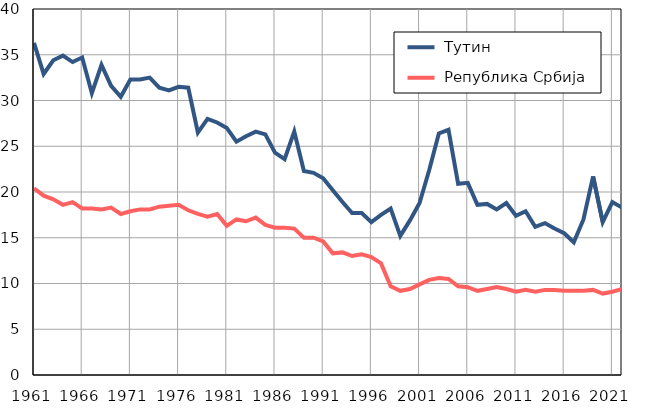
| Category |  Тутин |  Република Србија |
|---|---|---|
| 1961.0 | 36.3 | 20.4 |
| 1962.0 | 32.9 | 19.6 |
| 1963.0 | 34.4 | 19.2 |
| 1964.0 | 34.9 | 18.6 |
| 1965.0 | 34.2 | 18.9 |
| 1966.0 | 34.7 | 18.2 |
| 1967.0 | 30.8 | 18.2 |
| 1968.0 | 33.9 | 18.1 |
| 1969.0 | 31.6 | 18.3 |
| 1970.0 | 30.4 | 17.6 |
| 1971.0 | 32.3 | 17.9 |
| 1972.0 | 32.3 | 18.1 |
| 1973.0 | 32.5 | 18.1 |
| 1974.0 | 31.4 | 18.4 |
| 1975.0 | 31.1 | 18.5 |
| 1976.0 | 31.5 | 18.6 |
| 1977.0 | 31.4 | 18 |
| 1978.0 | 26.5 | 17.6 |
| 1979.0 | 28 | 17.3 |
| 1980.0 | 27.6 | 17.6 |
| 1981.0 | 27 | 16.3 |
| 1982.0 | 25.5 | 17 |
| 1983.0 | 26.1 | 16.8 |
| 1984.0 | 26.6 | 17.2 |
| 1985.0 | 26.3 | 16.4 |
| 1986.0 | 24.3 | 16.1 |
| 1987.0 | 23.6 | 16.1 |
| 1988.0 | 26.6 | 16 |
| 1989.0 | 22.3 | 15 |
| 1990.0 | 22.1 | 15 |
| 1991.0 | 21.5 | 14.6 |
| 1992.0 | 20.2 | 13.3 |
| 1993.0 | 18.9 | 13.4 |
| 1994.0 | 17.7 | 13 |
| 1995.0 | 17.7 | 13.2 |
| 1996.0 | 16.7 | 12.9 |
| 1997.0 | 17.5 | 12.2 |
| 1998.0 | 18.2 | 9.7 |
| 1999.0 | 15.2 | 9.2 |
| 2000.0 | 16.9 | 9.4 |
| 2001.0 | 18.8 | 9.9 |
| 2002.0 | 22.4 | 10.4 |
| 2003.0 | 26.4 | 10.6 |
| 2004.0 | 26.8 | 10.5 |
| 2005.0 | 20.9 | 9.7 |
| 2006.0 | 21 | 9.6 |
| 2007.0 | 18.6 | 9.2 |
| 2008.0 | 18.7 | 9.4 |
| 2009.0 | 18.1 | 9.6 |
| 2010.0 | 18.8 | 9.4 |
| 2011.0 | 17.4 | 9.1 |
| 2012.0 | 17.9 | 9.3 |
| 2013.0 | 16.2 | 9.1 |
| 2014.0 | 16.6 | 9.3 |
| 2015.0 | 16 | 9.3 |
| 2016.0 | 15.5 | 9.2 |
| 2017.0 | 14.5 | 9.2 |
| 2018.0 | 17 | 9.2 |
| 2019.0 | 21.7 | 9.3 |
| 2020.0 | 16.7 | 8.9 |
| 2021.0 | 18.9 | 9.1 |
| 2022.0 | 18.3 | 9.4 |